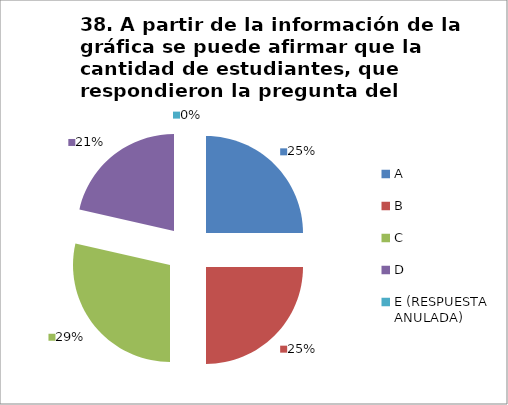
| Category | CANTIDAD DE RESPUESTAS PREGUNTA (38) | PORCENTAJE |
|---|---|---|
| A | 7 | 0.25 |
| B | 7 | 0.25 |
| C | 8 | 0.286 |
| D | 6 | 0.214 |
| E (RESPUESTA ANULADA) | 0 | 0 |